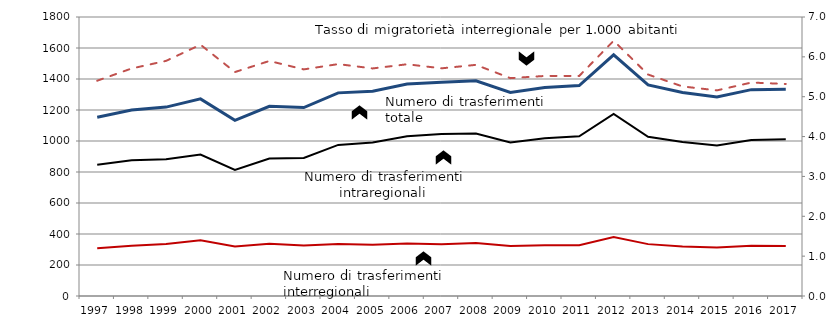
| Category | INTERREG | intrareg | Series 0 |
|---|---|---|---|
| 1997.0 | 307286 | 846169 | 1153455 |
| 1998.0 | 324852 | 875031 | 1199883 |
| 1999.0 | 335760 | 882971 | 1218731 |
| 2000.0 | 359008 | 912870 | 1271878 |
| 2001.0 | 320133 | 812873 | 1133006 |
| 2002.0 | 336461 | 887097 | 1223558 |
| 2003.0 | 325856 | 889960 | 1215816 |
| 2004.0 | 335643 | 974893 | 1310536 |
| 2005.0 | 330969 | 990741 | 1321710 |
| 2006.0 | 338068 | 1030230 | 1368298 |
| 2007.0 | 333815 | 1045716 | 1379531 |
| 2008.0 | 341154 | 1047593 | 1388747 |
| 2009.0 | 323015 | 989748 | 1312763 |
| 2010.0 | 327258 | 1018208 | 1345466 |
| 2011.0 | 327866 | 1030171 | 1358037 |
| 2012.0 | 381251 | 1175076 | 1556327 |
| 2013.0 | 334689 | 1027610 | 1362299 |
| 2014.0 | 319621 | 993555 | 1313176 |
| 2015.0 | 313288 | 970913 | 1284201 |
| 2016.0 | 324697 | 1006683 | 1331380 |
| 2017.0 | 322867 | 1011655 | 1334522 |